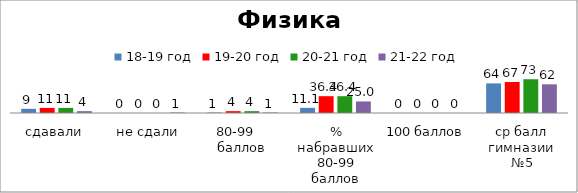
| Category | 18-19 год | 19-20 год | 20-21 год | 21-22 год |
|---|---|---|---|---|
| сдавали | 9 | 11 | 11 | 4 |
| не сдали | 0 | 0 | 0 | 1 |
| 80-99    баллов | 1 | 4 | 4 | 1 |
| % набравших 80-99 баллов | 11.111 | 36.364 | 36.364 | 25 |
| 100 баллов | 0 | 0 | 0 | 0 |
| ср балл гимназии №5 | 64 | 67 | 73 | 62 |